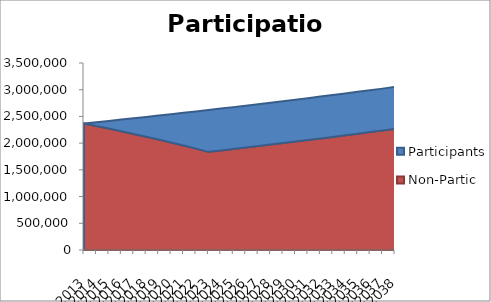
| Category | Non-Partic | Participants |
|---|---|---|
| 2013.0 | 2367580 | 0 |
| 2014.0 | 2320456.316 | 71273 |
| 2015.0 | 2272271.969 | 143852.986 |
| 2016.0 | 2222948.657 | 217820.773 |
| 2017.0 | 2172399.57 | 293265.707 |
| 2018.0 | 2120528.432 | 370286.632 |
| 2019.0 | 2067228.415 | 448992.962 |
| 2020.0 | 2012380.951 | 529505.884 |
| 2021.0 | 1955854.39 | 611959.691 |
| 2022.0 | 1897502.518 | 696503.267 |
| 2023.0 | 1837162.897 | 783301.746 |
| 2024.0 | 1863891.637 | 783301.746 |
| 2025.0 | 1890893.009 | 783301.746 |
| 2026.0 | 1918169.796 | 783301.746 |
| 2027.0 | 1945724.806 | 783301.746 |
| 2028.0 | 1973560.876 | 783301.746 |
| 2029.0 | 2001680.875 | 783301.746 |
| 2030.0 | 2030087.698 | 783301.746 |
| 2031.0 | 2058784.27 | 783301.746 |
| 2032.0 | 2087773.548 | 783301.746 |
| 2033.0 | 2117058.516 | 783301.746 |
| 2034.0 | 2146642.19 | 783301.746 |
| 2035.0 | 2176527.618 | 783301.746 |
| 2036.0 | 2206717.878 | 783301.746 |
| 2037.0 | 2237216.078 | 783301.746 |
| 2038.0 | 2268025.36 | 783301.746 |